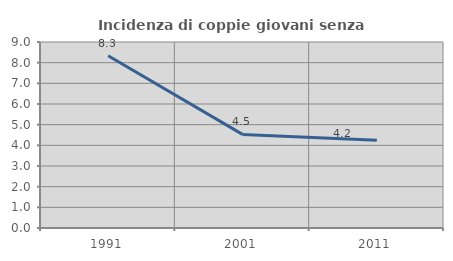
| Category | Incidenza di coppie giovani senza figli |
|---|---|
| 1991.0 | 8.333 |
| 2001.0 | 4.53 |
| 2011.0 | 4.247 |